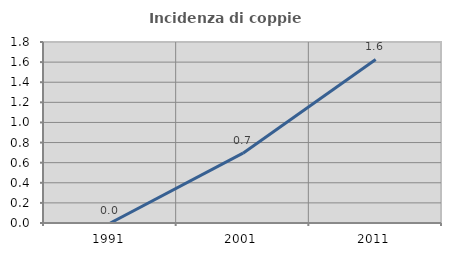
| Category | Incidenza di coppie miste |
|---|---|
| 1991.0 | 0 |
| 2001.0 | 0.694 |
| 2011.0 | 1.626 |